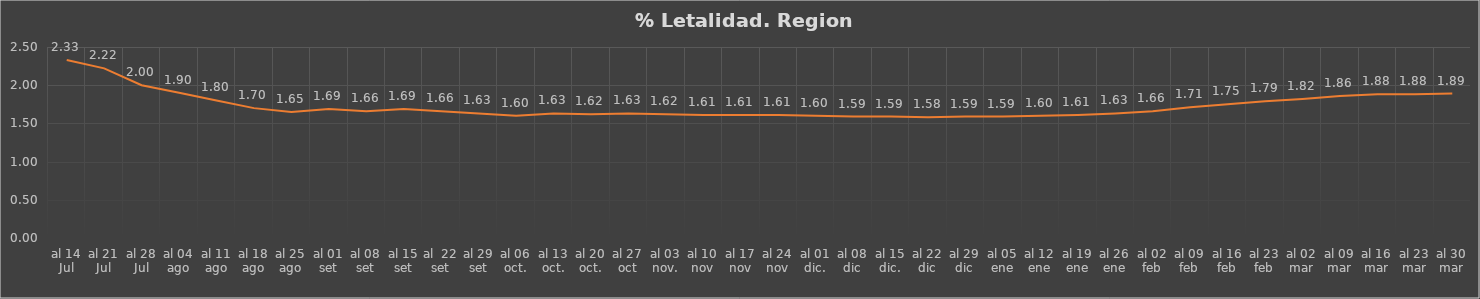
| Category | Series 1 |
|---|---|
| al 14 Jul | 2.33 |
| al 21 Jul | 2.22 |
| al 28 Jul | 2 |
| al 04 ago | 1.9 |
| al 11 ago | 1.8 |
| al 18 ago | 1.7 |
| al 25 ago | 1.65 |
| al 01 set | 1.69 |
| al 08 set | 1.66 |
| al 15 set | 1.69 |
| al  22 set | 1.66 |
| al 29 set | 1.63 |
| al 06 oct. | 1.6 |
| al 13 oct. | 1.63 |
| al 20 oct. | 1.62 |
| al 27 oct | 1.63 |
| al 03 nov. | 1.62 |
| al 10 nov | 1.61 |
| al 17 nov | 1.61 |
| al 24 nov | 1.61 |
| al 01 dic. | 1.6 |
| al 08 dic | 1.59 |
| al 15 dic. | 1.59 |
| al 22 dic | 1.58 |
| al 29 dic | 1.59 |
| al 05 ene | 1.59 |
| al 12 ene | 1.6 |
| al 19 ene | 1.61 |
| al 26 ene | 1.63 |
| al 02 feb | 1.66 |
| al 09 feb | 1.71 |
| al 16 feb | 1.75 |
| al 23 feb | 1.79 |
| al 02 mar | 1.82 |
| al 09 mar | 1.86 |
| al 16 mar | 1.88 |
| al 23 mar | 1.88 |
| al 30 mar | 1.89 |